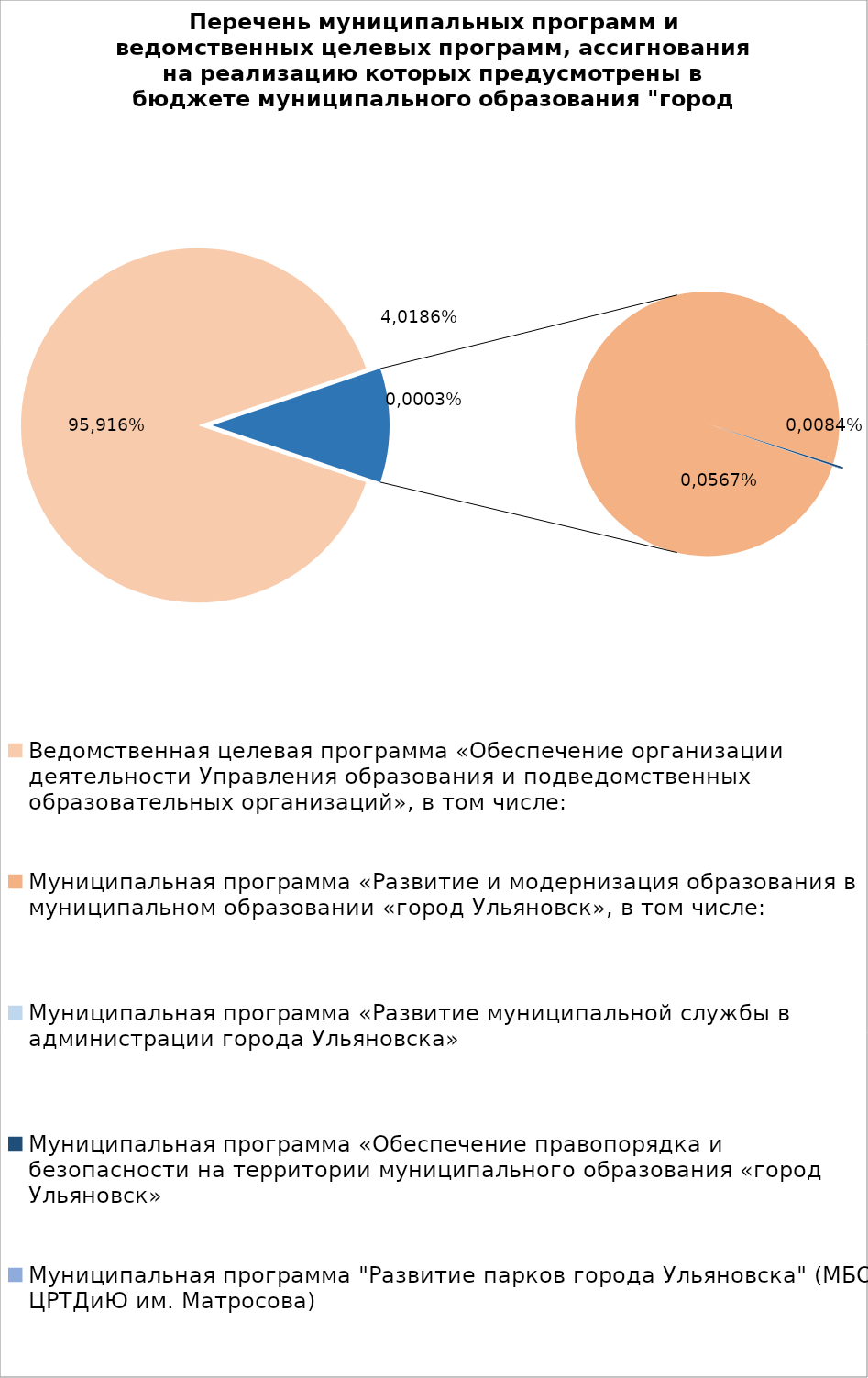
| Category | Series 0 |
|---|---|
| Ведомственная целевая программа «Обеспечение организации деятельности Управления образования и подведомственных образовательных организаций», в том числе: | 7877738.6 |
| Муниципальная программа «Развитие и модернизация образования в муниципальном образовании «город Ульяновск», в том числе: | 909739.44 |
| Муниципальная программа «Развитие муниципальной службы в администрации города Ульяновска» | 14.3 |
| Муниципальная программа «Обеспечение правопорядка и безопасности на территории муниципального образования «город Ульяновск» | 2100.73 |
| Муниципальная программа "Развитие парков города Ульяновска" (МБОУ ЦРТДиЮ им. Матросова) | 600 |